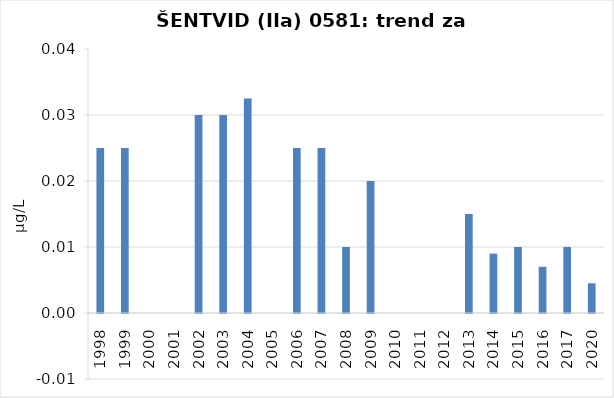
| Category | Vsota |
|---|---|
| 1998 | 0.025 |
| 1999 | 0.025 |
| 2000 | 0 |
| 2001 | 0 |
| 2002 | 0.03 |
| 2003 | 0.03 |
| 2004 | 0.032 |
| 2005 | 0 |
| 2006 | 0.025 |
| 2007 | 0.025 |
| 2008 | 0.01 |
| 2009 | 0.02 |
| 2010 | 0 |
| 2011 | 0 |
| 2012 | 0 |
| 2013 | 0.015 |
| 2014 | 0.009 |
| 2015 | 0.01 |
| 2016 | 0.007 |
| 2017 | 0.01 |
| 2020 | 0.005 |